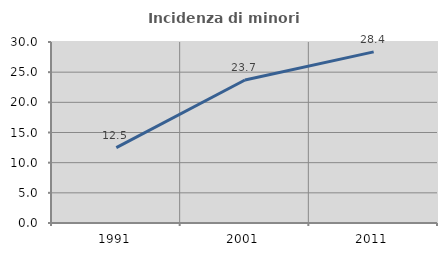
| Category | Incidenza di minori stranieri |
|---|---|
| 1991.0 | 12.5 |
| 2001.0 | 23.695 |
| 2011.0 | 28.36 |